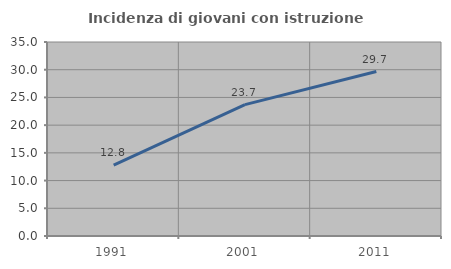
| Category | Incidenza di giovani con istruzione universitaria |
|---|---|
| 1991.0 | 12.782 |
| 2001.0 | 23.704 |
| 2011.0 | 29.67 |